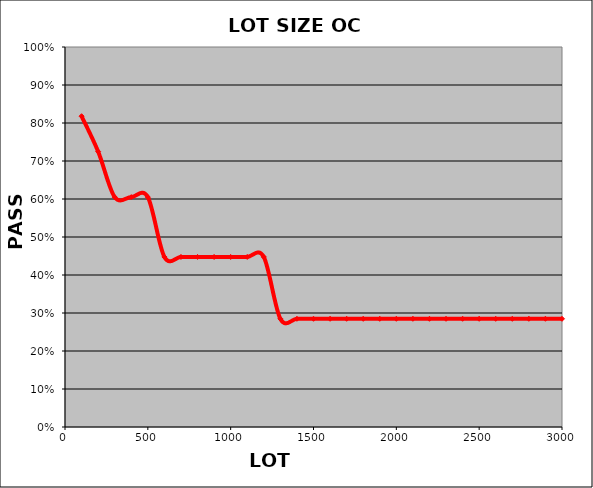
| Category | PASS
RATE |
|---|---|
| 100.0 | 0.818 |
| 200.0 | 0.725 |
| 300.0 | 0.605 |
| 400.0 | 0.605 |
| 500.0 | 0.605 |
| 600.0 | 0.448 |
| 700.0 | 0.448 |
| 800.0 | 0.448 |
| 900.0 | 0.448 |
| 1000.0 | 0.448 |
| 1100.0 | 0.448 |
| 1200.0 | 0.448 |
| 1300.0 | 0.285 |
| 1400.0 | 0.285 |
| 1500.0 | 0.285 |
| 1600.0 | 0.285 |
| 1700.0 | 0.285 |
| 1800.0 | 0.285 |
| 1900.0 | 0.285 |
| 2000.0 | 0.285 |
| 2100.0 | 0.285 |
| 2200.0 | 0.285 |
| 2300.0 | 0.285 |
| 2400.0 | 0.285 |
| 2500.0 | 0.285 |
| 2600.0 | 0.285 |
| 2700.0 | 0.285 |
| 2800.0 | 0.285 |
| 2900.0 | 0.285 |
| 3000.0 | 0.285 |